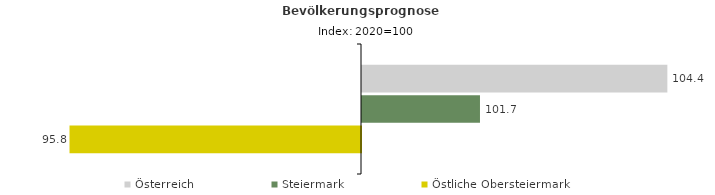
| Category | Österreich | Steiermark | Östliche Obersteiermark |
|---|---|---|---|
| 2020.0 | 104.4 | 101.7 | 95.8 |